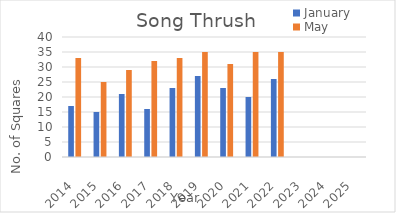
| Category | January | May |
|---|---|---|
| 2014.0 | 17 | 33 |
| 2015.0 | 15 | 25 |
| 2016.0 | 21 | 29 |
| 2017.0 | 16 | 32 |
| 2018.0 | 23 | 33 |
| 2019.0 | 27 | 35 |
| 2020.0 | 23 | 31 |
| 2021.0 | 20 | 35 |
| 2022.0 | 26 | 35 |
| 2023.0 | 0 | 0 |
| 2024.0 | 0 | 0 |
| 2025.0 | 0 | 0 |